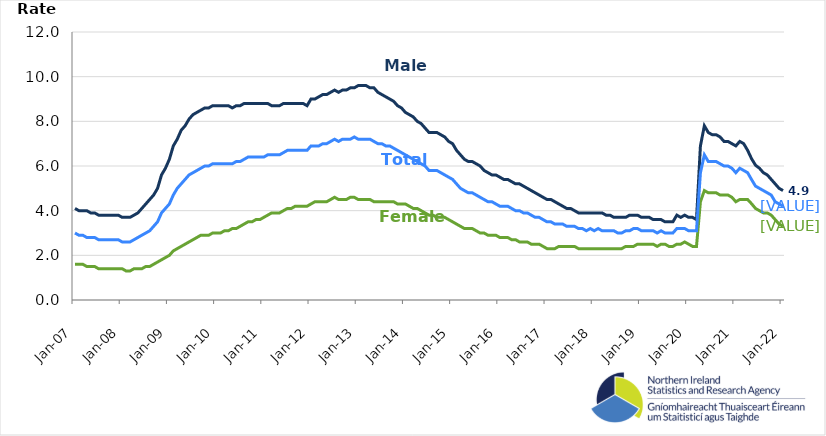
| Category | Male | Female | Total |
|---|---|---|---|
| 2007-01-01 | 4.1 | 1.6 | 3 |
| 2007-02-01 | 4 | 1.6 | 2.9 |
| 2007-03-01 | 4 | 1.6 | 2.9 |
| 2007-04-01 | 4 | 1.5 | 2.8 |
| 2007-05-01 | 3.9 | 1.5 | 2.8 |
| 2007-06-01 | 3.9 | 1.5 | 2.8 |
| 2007-07-01 | 3.8 | 1.4 | 2.7 |
| 2007-08-01 | 3.8 | 1.4 | 2.7 |
| 2007-09-01 | 3.8 | 1.4 | 2.7 |
| 2007-10-01 | 3.8 | 1.4 | 2.7 |
| 2007-11-01 | 3.8 | 1.4 | 2.7 |
| 2007-12-01 | 3.8 | 1.4 | 2.7 |
| 2008-01-01 | 3.7 | 1.4 | 2.6 |
| 2008-02-01 | 3.7 | 1.3 | 2.6 |
| 2008-03-01 | 3.7 | 1.3 | 2.6 |
| 2008-04-01 | 3.8 | 1.4 | 2.7 |
| 2008-05-01 | 3.9 | 1.4 | 2.8 |
| 2008-06-01 | 4.1 | 1.4 | 2.9 |
| 2008-07-01 | 4.3 | 1.5 | 3 |
| 2008-08-01 | 4.5 | 1.5 | 3.1 |
| 2008-09-01 | 4.7 | 1.6 | 3.3 |
| 2008-10-01 | 5 | 1.7 | 3.5 |
| 2008-11-01 | 5.6 | 1.8 | 3.9 |
| 2008-12-01 | 5.9 | 1.9 | 4.1 |
| 2009-01-01 | 6.3 | 2 | 4.3 |
| 2009-02-01 | 6.9 | 2.2 | 4.7 |
| 2009-03-01 | 7.2 | 2.3 | 5 |
| 2009-04-01 | 7.6 | 2.4 | 5.2 |
| 2009-05-01 | 7.8 | 2.5 | 5.4 |
| 2009-06-01 | 8.1 | 2.6 | 5.6 |
| 2009-07-01 | 8.3 | 2.7 | 5.7 |
| 2009-08-01 | 8.4 | 2.8 | 5.8 |
| 2009-09-01 | 8.5 | 2.9 | 5.9 |
| 2009-10-01 | 8.6 | 2.9 | 6 |
| 2009-11-01 | 8.6 | 2.9 | 6 |
| 2009-12-01 | 8.7 | 3 | 6.1 |
| 2010-01-01 | 8.7 | 3 | 6.1 |
| 2010-02-01 | 8.7 | 3 | 6.1 |
| 2010-03-01 | 8.7 | 3.1 | 6.1 |
| 2010-04-01 | 8.7 | 3.1 | 6.1 |
| 2010-05-01 | 8.6 | 3.2 | 6.1 |
| 2010-06-01 | 8.7 | 3.2 | 6.2 |
| 2010-07-01 | 8.7 | 3.3 | 6.2 |
| 2010-08-01 | 8.8 | 3.4 | 6.3 |
| 2010-09-01 | 8.8 | 3.5 | 6.4 |
| 2010-10-01 | 8.8 | 3.5 | 6.4 |
| 2010-11-01 | 8.8 | 3.6 | 6.4 |
| 2010-12-01 | 8.8 | 3.6 | 6.4 |
| 2011-01-01 | 8.8 | 3.7 | 6.4 |
| 2011-02-01 | 8.8 | 3.8 | 6.5 |
| 2011-03-01 | 8.7 | 3.9 | 6.5 |
| 2011-04-01 | 8.7 | 3.9 | 6.5 |
| 2011-05-01 | 8.7 | 3.9 | 6.5 |
| 2011-06-01 | 8.8 | 4 | 6.6 |
| 2011-07-01 | 8.8 | 4.1 | 6.7 |
| 2011-08-01 | 8.8 | 4.1 | 6.7 |
| 2011-09-01 | 8.8 | 4.2 | 6.7 |
| 2011-10-01 | 8.8 | 4.2 | 6.7 |
| 2011-11-01 | 8.8 | 4.2 | 6.7 |
| 2011-12-01 | 8.7 | 4.2 | 6.7 |
| 2012-01-01 | 9 | 4.3 | 6.9 |
| 2012-02-01 | 9 | 4.4 | 6.9 |
| 2012-03-01 | 9.1 | 4.4 | 6.9 |
| 2012-04-01 | 9.2 | 4.4 | 7 |
| 2012-05-01 | 9.2 | 4.4 | 7 |
| 2012-06-01 | 9.3 | 4.5 | 7.1 |
| 2012-07-01 | 9.4 | 4.6 | 7.2 |
| 2012-08-01 | 9.3 | 4.5 | 7.1 |
| 2012-09-01 | 9.4 | 4.5 | 7.2 |
| 2012-10-01 | 9.4 | 4.5 | 7.2 |
| 2012-11-01 | 9.5 | 4.6 | 7.2 |
| 2012-12-01 | 9.5 | 4.6 | 7.3 |
| 2013-01-01 | 9.6 | 4.5 | 7.2 |
| 2013-02-01 | 9.6 | 4.5 | 7.2 |
| 2013-03-01 | 9.6 | 4.5 | 7.2 |
| 2013-04-01 | 9.5 | 4.5 | 7.2 |
| 2013-05-01 | 9.5 | 4.4 | 7.1 |
| 2013-06-01 | 9.3 | 4.4 | 7 |
| 2013-07-01 | 9.2 | 4.4 | 7 |
| 2013-08-01 | 9.1 | 4.4 | 6.9 |
| 2013-09-01 | 9 | 4.4 | 6.9 |
| 2013-10-01 | 8.9 | 4.4 | 6.8 |
| 2013-11-01 | 8.7 | 4.3 | 6.7 |
| 2013-12-01 | 8.6 | 4.3 | 6.6 |
| 2014-01-01 | 8.4 | 4.3 | 6.5 |
| 2014-02-01 | 8.3 | 4.2 | 6.4 |
| 2014-03-01 | 8.2 | 4.1 | 6.3 |
| 2014-04-01 | 8 | 4.1 | 6.2 |
| 2014-05-01 | 7.9 | 4 | 6.1 |
| 2014-06-01 | 7.7 | 3.9 | 6 |
| 2014-07-01 | 7.5 | 3.8 | 5.8 |
| 2014-08-01 | 7.5 | 3.8 | 5.8 |
| 2014-09-01 | 7.5 | 3.7 | 5.8 |
| 2014-10-01 | 7.4 | 3.7 | 5.7 |
| 2014-11-01 | 7.3 | 3.7 | 5.6 |
| 2014-12-01 | 7.1 | 3.6 | 5.5 |
| 2015-01-01 | 7 | 3.5 | 5.4 |
| 2015-02-01 | 6.7 | 3.4 | 5.2 |
| 2015-03-01 | 6.5 | 3.3 | 5 |
| 2015-04-01 | 6.3 | 3.2 | 4.9 |
| 2015-05-01 | 6.2 | 3.2 | 4.8 |
| 2015-06-01 | 6.2 | 3.2 | 4.8 |
| 2015-07-01 | 6.1 | 3.1 | 4.7 |
| 2015-08-01 | 6 | 3 | 4.6 |
| 2015-09-01 | 5.8 | 3 | 4.5 |
| 2015-10-01 | 5.7 | 2.9 | 4.4 |
| 2015-11-01 | 5.6 | 2.9 | 4.4 |
| 2015-12-01 | 5.6 | 2.9 | 4.3 |
| 2016-01-01 | 5.5 | 2.8 | 4.2 |
| 2016-02-01 | 5.4 | 2.8 | 4.2 |
| 2016-03-01 | 5.4 | 2.8 | 4.2 |
| 2016-04-01 | 5.3 | 2.7 | 4.1 |
| 2016-05-01 | 5.2 | 2.7 | 4 |
| 2016-06-01 | 5.2 | 2.6 | 4 |
| 2016-07-01 | 5.1 | 2.6 | 3.9 |
| 2016-08-01 | 5 | 2.6 | 3.9 |
| 2016-09-01 | 4.9 | 2.5 | 3.8 |
| 2016-10-01 | 4.8 | 2.5 | 3.7 |
| 2016-11-01 | 4.7 | 2.5 | 3.7 |
| 2016-12-01 | 4.6 | 2.4 | 3.6 |
| 2017-01-01 | 4.5 | 2.3 | 3.5 |
| 2017-02-01 | 4.5 | 2.3 | 3.5 |
| 2017-03-01 | 4.4 | 2.3 | 3.4 |
| 2017-04-01 | 4.3 | 2.4 | 3.4 |
| 2017-05-01 | 4.2 | 2.4 | 3.4 |
| 2017-06-01 | 4.1 | 2.4 | 3.3 |
| 2017-07-01 | 4.1 | 2.4 | 3.3 |
| 2017-08-01 | 4 | 2.4 | 3.3 |
| 2017-09-01 | 3.9 | 2.3 | 3.2 |
| 2017-10-01 | 3.9 | 2.3 | 3.2 |
| 2017-11-01 | 3.9 | 2.3 | 3.1 |
| 2017-12-01 | 3.9 | 2.3 | 3.2 |
| 2018-01-01 | 3.9 | 2.3 | 3.1 |
| 2018-02-01 | 3.9 | 2.3 | 3.2 |
| 2018-03-01 | 3.9 | 2.3 | 3.1 |
| 2018-04-01 | 3.8 | 2.3 | 3.1 |
| 2018-05-01 | 3.8 | 2.3 | 3.1 |
| 2018-06-01 | 3.7 | 2.3 | 3.1 |
| 2018-07-01 | 3.7 | 2.3 | 3 |
| 2018-08-01 | 3.7 | 2.3 | 3 |
| 2018-09-01 | 3.7 | 2.4 | 3.1 |
| 2018-10-01 | 3.8 | 2.4 | 3.1 |
| 2018-11-01 | 3.8 | 2.4 | 3.2 |
| 2018-12-01 | 3.8 | 2.5 | 3.2 |
| 2019-01-01 | 3.7 | 2.5 | 3.1 |
| 2019-02-01 | 3.7 | 2.5 | 3.1 |
| 2019-03-01 | 3.7 | 2.5 | 3.1 |
| 2019-04-01 | 3.6 | 2.5 | 3.1 |
| 2019-05-01 | 3.6 | 2.4 | 3 |
| 2019-06-01 | 3.6 | 2.5 | 3.1 |
| 2019-07-01 | 3.5 | 2.5 | 3 |
| 2019-08-01 | 3.5 | 2.4 | 3 |
| 2019-09-01 | 3.5 | 2.4 | 3 |
| 2019-10-01 | 3.8 | 2.5 | 3.2 |
| 2019-11-01 | 3.7 | 2.5 | 3.2 |
| 2019-12-01 | 3.8 | 2.6 | 3.2 |
| 2020-01-01 | 3.7 | 2.5 | 3.1 |
| 2020-02-01 | 3.7 | 2.4 | 3.1 |
| 2020-03-01 | 3.6 | 2.4 | 3.1 |
| 2020-04-01 | 6.9 | 4.4 | 5.7 |
| 2020-05-01 | 7.8 | 4.9 | 6.5 |
| 2020-06-01 | 7.5 | 4.8 | 6.2 |
| 2020-07-01 | 7.4 | 4.8 | 6.2 |
| 2020-08-01 | 7.4 | 4.8 | 6.2 |
| 2020-09-01 | 7.3 | 4.7 | 6.1 |
| 2020-10-01 | 7.1 | 4.7 | 6 |
| 2020-11-01 | 7.1 | 4.7 | 6 |
| 2020-12-01 | 7 | 4.6 | 5.9 |
| 2021-01-01 | 6.9 | 4.4 | 5.7 |
| 2021-02-01 | 7.1 | 4.5 | 5.9 |
| 2021-03-01 | 7 | 4.5 | 5.8 |
| 2021-04-01 | 6.7 | 4.5 | 5.7 |
| 2021-05-01 | 6.326 | 4.311 | 5.393 |
| 2021-06-01 | 6.036 | 4.1 | 5.1 |
| 2021-07-01 | 5.9 | 4 | 5 |
| 2021-08-01 | 5.7 | 3.9 | 4.9 |
| 2021-09-01 | 5.6 | 3.9 | 4.8 |
| 2021-10-01 | 5.4 | 3.8 | 4.7 |
| 2021-11-01 | 5.2 | 3.6 | 4.4 |
| 2021-12-01 | 5 | 3.4 | 4.3 |
| 2022-01-01 | 4.9 | 3.3 | 4.2 |